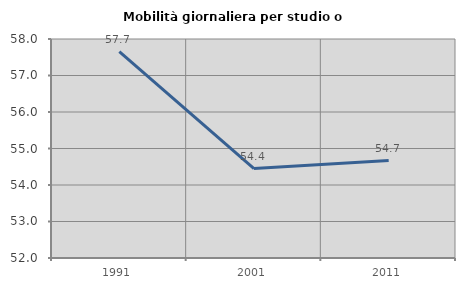
| Category | Mobilità giornaliera per studio o lavoro |
|---|---|
| 1991.0 | 57.655 |
| 2001.0 | 54.449 |
| 2011.0 | 54.668 |